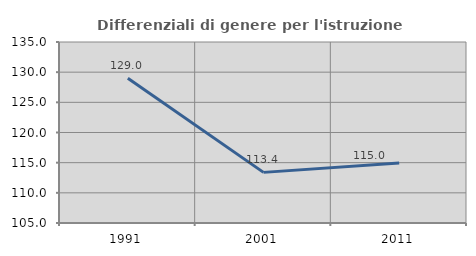
| Category | Differenziali di genere per l'istruzione superiore |
|---|---|
| 1991.0 | 128.991 |
| 2001.0 | 113.39 |
| 2011.0 | 114.958 |